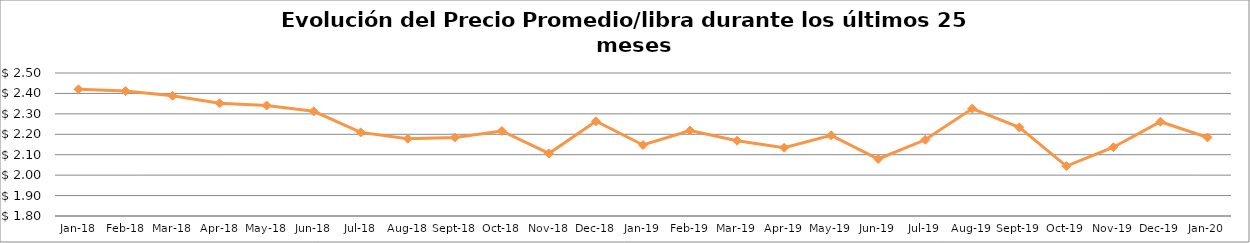
| Category | Series 0 |
|---|---|
| 2018-01-01 | 2.42 |
| 2018-02-01 | 2.412 |
| 2018-03-01 | 2.388 |
| 2018-04-01 | 2.352 |
| 2018-05-01 | 2.341 |
| 2018-06-01 | 2.312 |
| 2018-07-01 | 2.209 |
| 2018-08-01 | 2.178 |
| 2018-09-01 | 2.184 |
| 2018-10-01 | 2.216 |
| 2018-11-01 | 2.106 |
| 2018-12-01 | 2.264 |
| 2019-01-01 | 2.147 |
| 2019-02-01 | 2.218 |
| 2019-03-01 | 2.169 |
| 2019-04-01 | 2.134 |
| 2019-05-01 | 2.195 |
| 2019-06-01 | 2.079 |
| 2019-07-01 | 2.173 |
| 2019-08-01 | 2.326 |
| 2019-09-01 | 2.234 |
| 2019-10-01 | 2.044 |
| 2019-11-01 | 2.137 |
| 2019-12-01 | 2.262 |
| 2020-01-01 | 2.185 |